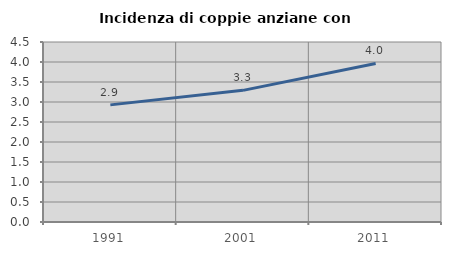
| Category | Incidenza di coppie anziane con figli |
|---|---|
| 1991.0 | 2.928 |
| 2001.0 | 3.291 |
| 2011.0 | 3.963 |